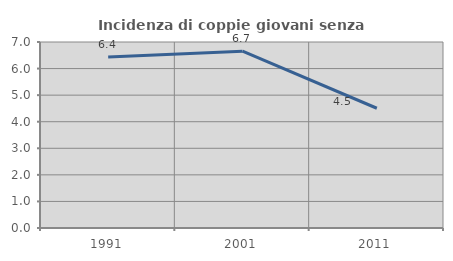
| Category | Incidenza di coppie giovani senza figli |
|---|---|
| 1991.0 | 6.439 |
| 2001.0 | 6.655 |
| 2011.0 | 4.507 |